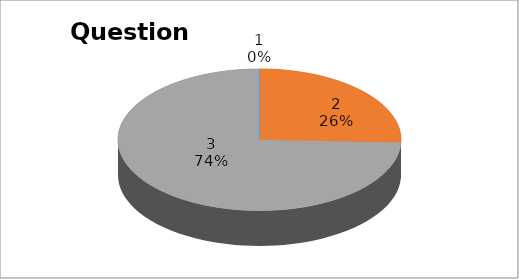
| Category | Series 0 |
|---|---|
| 0 | 0 |
| 1 | 10 |
| 2 | 29 |